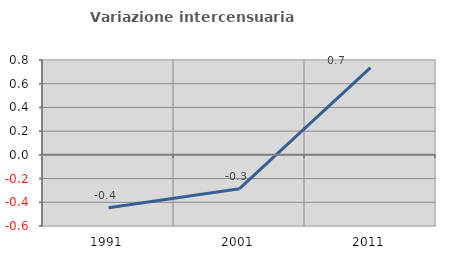
| Category | Variazione intercensuaria annua |
|---|---|
| 1991.0 | -0.447 |
| 2001.0 | -0.285 |
| 2011.0 | 0.736 |